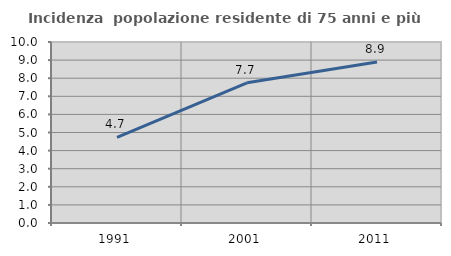
| Category | Incidenza  popolazione residente di 75 anni e più |
|---|---|
| 1991.0 | 4.734 |
| 2001.0 | 7.746 |
| 2011.0 | 8.893 |